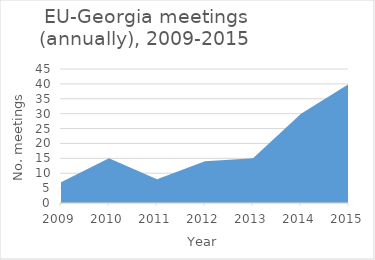
| Category | Number of meetings |
|---|---|
| 2009.0 | 7 |
| 2010.0 | 15 |
| 2011.0 | 8 |
| 2012.0 | 14 |
| 2013.0 | 15 |
| 2014.0 | 30 |
| 2015.0 | 40 |